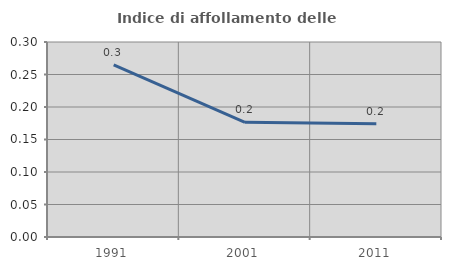
| Category | Indice di affollamento delle abitazioni  |
|---|---|
| 1991.0 | 0.265 |
| 2001.0 | 0.176 |
| 2011.0 | 0.174 |